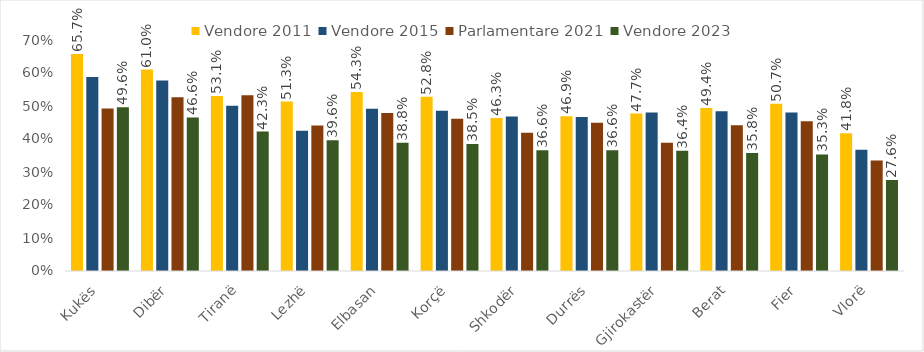
| Category | Vendore 2011 | Vendore 2015 | Parlamentare 2021 | Vendore 2023 |
|---|---|---|---|---|
| Kukës | 0.657 | 0.588 | 0.493 | 0.496 |
| Dibër | 0.61 | 0.577 | 0.527 | 0.466 |
| Tiranë | 0.531 | 0.501 | 0.532 | 0.423 |
| Lezhë | 0.513 | 0.425 | 0.441 | 0.396 |
| Elbasan | 0.543 | 0.492 | 0.479 | 0.388 |
| Korçë | 0.528 | 0.486 | 0.461 | 0.385 |
| Shkodër | 0.463 | 0.468 | 0.419 | 0.366 |
| Durrës | 0.469 | 0.467 | 0.45 | 0.366 |
| Gjirokastër | 0.477 | 0.48 | 0.388 | 0.364 |
| Berat | 0.494 | 0.484 | 0.442 | 0.358 |
| Fier | 0.507 | 0.48 | 0.454 | 0.353 |
| Vlorë | 0.418 | 0.368 | 0.335 | 0.276 |